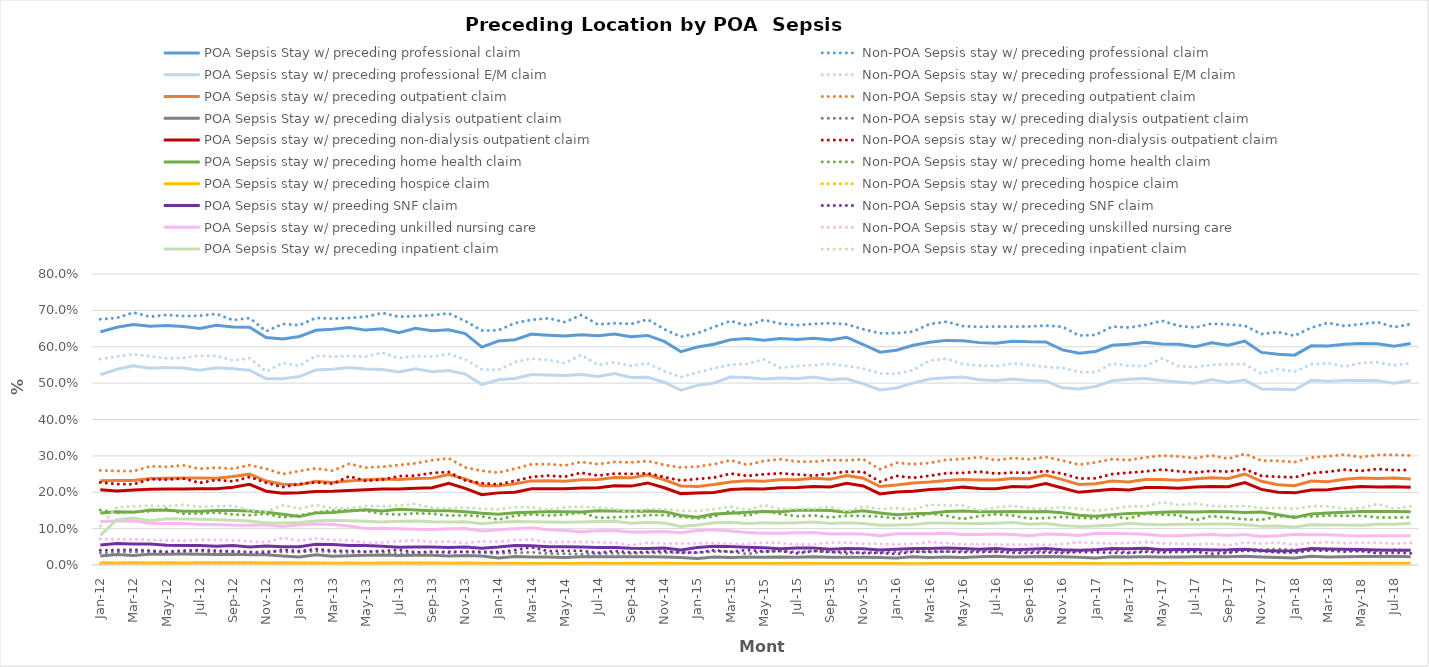
| Category | POA Sepsis Stay w/ preceding professional claim | Non-POA Sepsis stay w/ preceding professional claim | POA Sepsis stay w/ preceding professional E/M claim | Non-POA Sepsis stay w/ preceding professional E/M claim | POA Sepsis stay w/ preceding outpatient claim | Non-POA Sepsis stay w/ preceding outpatient claim | POA Sepsis Stay w/ preceding dialysis outpatient claim | Non-POA sepsis stay w/ preceding dialysis outpatient claim | POA Sepsis stay w/ preceding non-dialysis outpatient claim | Non-POA sepsis stay w/ preceding non-dialysis outpatient claim | POA Sepsis stay w/ preceding home health claim | Non-POA Sepsis stay w/ preceding home health claim | POA Sepsis stay w/ preceding hospice claim | Non-POA Sepsis stay w/ preceding hospice claim | POA Sepsis stay w/ preeding SNF claim | Non-POA Sepsis stay w/ preceding SNF claim | POA Sepsis stay w/ preceding unkilled nursing care | Non-POA Sepsis stay w/ preceding unskilled nursing care | POA Sepsis Stay w/ preceding inpatient claim | Non-POA Sepsis stay w/ preceding inpatient claim |
|---|---|---|---|---|---|---|---|---|---|---|---|---|---|---|---|---|---|---|---|---|
| 2012-01-01 | 0.641 | 0.676 | 0.523 | 0.566 | 0.232 | 0.26 | 0.025 | 0.033 | 0.207 | 0.227 | 0.143 | 0.151 | 0.006 | 0.003 | 0.055 | 0.041 | 0.119 | 0.071 | 0.082 | 0.107 |
| 2012-02-01 | 0.654 | 0.679 | 0.538 | 0.573 | 0.232 | 0.258 | 0.029 | 0.036 | 0.203 | 0.222 | 0.146 | 0.143 | 0.006 | 0.003 | 0.059 | 0.041 | 0.121 | 0.07 | 0.124 | 0.158 |
| 2012-03-01 | 0.661 | 0.694 | 0.548 | 0.579 | 0.232 | 0.258 | 0.026 | 0.036 | 0.206 | 0.222 | 0.145 | 0.147 | 0.006 | 0.004 | 0.058 | 0.042 | 0.122 | 0.071 | 0.129 | 0.161 |
| 2012-04-01 | 0.656 | 0.682 | 0.541 | 0.573 | 0.238 | 0.271 | 0.03 | 0.036 | 0.208 | 0.236 | 0.151 | 0.148 | 0.005 | 0.003 | 0.058 | 0.039 | 0.115 | 0.069 | 0.121 | 0.163 |
| 2012-05-01 | 0.658 | 0.688 | 0.543 | 0.568 | 0.238 | 0.27 | 0.029 | 0.035 | 0.209 | 0.235 | 0.15 | 0.154 | 0.006 | 0.003 | 0.054 | 0.037 | 0.114 | 0.068 | 0.127 | 0.162 |
| 2012-06-01 | 0.656 | 0.684 | 0.542 | 0.569 | 0.239 | 0.274 | 0.03 | 0.036 | 0.209 | 0.238 | 0.148 | 0.141 | 0.006 | 0.004 | 0.054 | 0.04 | 0.114 | 0.067 | 0.126 | 0.166 |
| 2012-07-01 | 0.651 | 0.685 | 0.535 | 0.575 | 0.239 | 0.265 | 0.03 | 0.039 | 0.209 | 0.226 | 0.148 | 0.141 | 0.006 | 0.004 | 0.053 | 0.041 | 0.112 | 0.07 | 0.126 | 0.16 |
| 2012-08-01 | 0.659 | 0.69 | 0.542 | 0.575 | 0.239 | 0.268 | 0.029 | 0.034 | 0.21 | 0.234 | 0.15 | 0.144 | 0.006 | 0.004 | 0.051 | 0.039 | 0.111 | 0.069 | 0.125 | 0.161 |
| 2012-09-01 | 0.654 | 0.673 | 0.54 | 0.562 | 0.244 | 0.265 | 0.03 | 0.035 | 0.214 | 0.23 | 0.15 | 0.139 | 0.006 | 0.003 | 0.053 | 0.038 | 0.109 | 0.068 | 0.123 | 0.163 |
| 2012-10-01 | 0.654 | 0.679 | 0.536 | 0.569 | 0.25 | 0.275 | 0.028 | 0.033 | 0.222 | 0.242 | 0.148 | 0.137 | 0.006 | 0.003 | 0.05 | 0.036 | 0.11 | 0.065 | 0.121 | 0.151 |
| 2012-11-01 | 0.626 | 0.643 | 0.512 | 0.532 | 0.231 | 0.264 | 0.028 | 0.038 | 0.203 | 0.226 | 0.145 | 0.141 | 0.006 | 0.003 | 0.052 | 0.033 | 0.111 | 0.063 | 0.116 | 0.147 |
| 2012-12-01 | 0.621 | 0.662 | 0.512 | 0.556 | 0.222 | 0.25 | 0.025 | 0.036 | 0.198 | 0.214 | 0.14 | 0.131 | 0.006 | 0.004 | 0.05 | 0.042 | 0.106 | 0.075 | 0.116 | 0.165 |
| 2013-01-01 | 0.628 | 0.659 | 0.518 | 0.548 | 0.22 | 0.258 | 0.022 | 0.036 | 0.198 | 0.223 | 0.133 | 0.136 | 0.005 | 0.003 | 0.05 | 0.038 | 0.11 | 0.067 | 0.117 | 0.155 |
| 2013-02-01 | 0.645 | 0.679 | 0.536 | 0.575 | 0.23 | 0.266 | 0.028 | 0.038 | 0.202 | 0.228 | 0.143 | 0.144 | 0.005 | 0.003 | 0.057 | 0.044 | 0.113 | 0.073 | 0.121 | 0.165 |
| 2013-03-01 | 0.648 | 0.677 | 0.538 | 0.573 | 0.227 | 0.259 | 0.024 | 0.036 | 0.203 | 0.223 | 0.144 | 0.149 | 0.005 | 0.003 | 0.057 | 0.039 | 0.111 | 0.069 | 0.123 | 0.156 |
| 2013-04-01 | 0.653 | 0.679 | 0.543 | 0.575 | 0.231 | 0.278 | 0.026 | 0.034 | 0.205 | 0.244 | 0.148 | 0.15 | 0.006 | 0.002 | 0.054 | 0.039 | 0.107 | 0.068 | 0.122 | 0.156 |
| 2013-05-01 | 0.646 | 0.682 | 0.539 | 0.573 | 0.234 | 0.268 | 0.027 | 0.036 | 0.207 | 0.231 | 0.152 | 0.149 | 0.005 | 0.002 | 0.053 | 0.036 | 0.1 | 0.06 | 0.12 | 0.162 |
| 2013-06-01 | 0.649 | 0.693 | 0.538 | 0.584 | 0.236 | 0.27 | 0.027 | 0.036 | 0.209 | 0.235 | 0.148 | 0.141 | 0.006 | 0.004 | 0.052 | 0.039 | 0.101 | 0.062 | 0.118 | 0.162 |
| 2013-07-01 | 0.639 | 0.682 | 0.531 | 0.569 | 0.235 | 0.275 | 0.026 | 0.03 | 0.209 | 0.244 | 0.153 | 0.139 | 0.005 | 0.003 | 0.049 | 0.041 | 0.1 | 0.066 | 0.12 | 0.163 |
| 2013-08-01 | 0.651 | 0.684 | 0.539 | 0.574 | 0.238 | 0.28 | 0.027 | 0.034 | 0.211 | 0.246 | 0.151 | 0.142 | 0.005 | 0.004 | 0.05 | 0.035 | 0.098 | 0.068 | 0.121 | 0.168 |
| 2013-09-01 | 0.644 | 0.687 | 0.531 | 0.573 | 0.239 | 0.288 | 0.027 | 0.035 | 0.212 | 0.253 | 0.149 | 0.141 | 0.005 | 0.003 | 0.05 | 0.037 | 0.098 | 0.063 | 0.119 | 0.157 |
| 2013-10-01 | 0.647 | 0.692 | 0.535 | 0.58 | 0.249 | 0.293 | 0.024 | 0.038 | 0.224 | 0.256 | 0.149 | 0.136 | 0.005 | 0.002 | 0.048 | 0.034 | 0.1 | 0.065 | 0.118 | 0.156 |
| 2013-11-01 | 0.636 | 0.671 | 0.525 | 0.565 | 0.237 | 0.268 | 0.026 | 0.036 | 0.211 | 0.232 | 0.147 | 0.137 | 0.005 | 0.003 | 0.049 | 0.037 | 0.1 | 0.06 | 0.119 | 0.158 |
| 2013-12-01 | 0.599 | 0.644 | 0.496 | 0.538 | 0.218 | 0.259 | 0.024 | 0.034 | 0.193 | 0.225 | 0.142 | 0.134 | 0.005 | 0.002 | 0.046 | 0.036 | 0.094 | 0.065 | 0.114 | 0.155 |
| 2014-01-01 | 0.616 | 0.645 | 0.509 | 0.536 | 0.218 | 0.254 | 0.019 | 0.032 | 0.198 | 0.222 | 0.139 | 0.125 | 0.004 | 0.002 | 0.049 | 0.036 | 0.097 | 0.064 | 0.118 | 0.153 |
| 2014-02-01 | 0.619 | 0.665 | 0.513 | 0.558 | 0.223 | 0.265 | 0.023 | 0.034 | 0.2 | 0.231 | 0.144 | 0.136 | 0.005 | 0.002 | 0.054 | 0.041 | 0.099 | 0.068 | 0.12 | 0.159 |
| 2014-03-01 | 0.635 | 0.674 | 0.524 | 0.567 | 0.231 | 0.277 | 0.022 | 0.035 | 0.209 | 0.242 | 0.145 | 0.139 | 0.004 | 0.002 | 0.053 | 0.049 | 0.102 | 0.07 | 0.119 | 0.159 |
| 2014-04-01 | 0.632 | 0.678 | 0.522 | 0.564 | 0.231 | 0.277 | 0.022 | 0.031 | 0.21 | 0.246 | 0.147 | 0.136 | 0.004 | 0.004 | 0.05 | 0.038 | 0.097 | 0.062 | 0.118 | 0.152 |
| 2014-05-01 | 0.629 | 0.667 | 0.521 | 0.555 | 0.23 | 0.273 | 0.021 | 0.031 | 0.21 | 0.243 | 0.146 | 0.139 | 0.004 | 0.003 | 0.05 | 0.039 | 0.095 | 0.064 | 0.118 | 0.158 |
| 2014-06-01 | 0.633 | 0.687 | 0.523 | 0.577 | 0.234 | 0.283 | 0.023 | 0.03 | 0.212 | 0.254 | 0.146 | 0.144 | 0.004 | 0.002 | 0.049 | 0.039 | 0.092 | 0.063 | 0.118 | 0.16 |
| 2014-07-01 | 0.63 | 0.661 | 0.518 | 0.55 | 0.235 | 0.277 | 0.023 | 0.031 | 0.212 | 0.246 | 0.149 | 0.13 | 0.005 | 0.002 | 0.048 | 0.033 | 0.094 | 0.062 | 0.12 | 0.158 |
| 2014-08-01 | 0.635 | 0.665 | 0.526 | 0.557 | 0.24 | 0.283 | 0.023 | 0.032 | 0.218 | 0.251 | 0.149 | 0.131 | 0.004 | 0.003 | 0.048 | 0.038 | 0.095 | 0.061 | 0.12 | 0.154 |
| 2014-09-01 | 0.628 | 0.663 | 0.515 | 0.547 | 0.24 | 0.282 | 0.023 | 0.032 | 0.217 | 0.25 | 0.148 | 0.133 | 0.005 | 0.004 | 0.046 | 0.034 | 0.091 | 0.054 | 0.115 | 0.145 |
| 2014-10-01 | 0.631 | 0.675 | 0.516 | 0.555 | 0.248 | 0.286 | 0.023 | 0.034 | 0.226 | 0.252 | 0.148 | 0.137 | 0.004 | 0.002 | 0.046 | 0.036 | 0.091 | 0.061 | 0.118 | 0.154 |
| 2014-11-01 | 0.615 | 0.648 | 0.503 | 0.533 | 0.234 | 0.275 | 0.022 | 0.033 | 0.212 | 0.242 | 0.147 | 0.137 | 0.005 | 0.003 | 0.047 | 0.038 | 0.092 | 0.059 | 0.115 | 0.153 |
| 2014-12-01 | 0.586 | 0.627 | 0.481 | 0.516 | 0.217 | 0.268 | 0.021 | 0.036 | 0.196 | 0.232 | 0.136 | 0.132 | 0.004 | 0.002 | 0.041 | 0.034 | 0.089 | 0.059 | 0.106 | 0.149 |
| 2015-01-01 | 0.599 | 0.637 | 0.494 | 0.529 | 0.216 | 0.271 | 0.018 | 0.034 | 0.198 | 0.237 | 0.131 | 0.128 | 0.004 | 0.003 | 0.048 | 0.034 | 0.095 | 0.059 | 0.11 | 0.148 |
| 2015-02-01 | 0.607 | 0.654 | 0.5 | 0.541 | 0.221 | 0.277 | 0.022 | 0.037 | 0.199 | 0.24 | 0.14 | 0.133 | 0.004 | 0.002 | 0.052 | 0.041 | 0.097 | 0.061 | 0.116 | 0.154 |
| 2015-03-01 | 0.619 | 0.671 | 0.517 | 0.55 | 0.228 | 0.288 | 0.021 | 0.037 | 0.207 | 0.251 | 0.142 | 0.149 | 0.004 | 0.003 | 0.051 | 0.036 | 0.094 | 0.058 | 0.117 | 0.16 |
| 2015-04-01 | 0.623 | 0.658 | 0.515 | 0.553 | 0.232 | 0.275 | 0.022 | 0.03 | 0.209 | 0.245 | 0.145 | 0.135 | 0.004 | 0.002 | 0.049 | 0.041 | 0.089 | 0.057 | 0.114 | 0.151 |
| 2015-05-01 | 0.618 | 0.674 | 0.512 | 0.565 | 0.23 | 0.286 | 0.021 | 0.037 | 0.209 | 0.249 | 0.147 | 0.15 | 0.004 | 0.004 | 0.047 | 0.037 | 0.087 | 0.062 | 0.116 | 0.165 |
| 2015-06-01 | 0.623 | 0.664 | 0.514 | 0.542 | 0.234 | 0.291 | 0.022 | 0.038 | 0.212 | 0.252 | 0.146 | 0.14 | 0.004 | 0.002 | 0.045 | 0.038 | 0.087 | 0.06 | 0.115 | 0.154 |
| 2015-07-01 | 0.62 | 0.659 | 0.512 | 0.547 | 0.234 | 0.284 | 0.021 | 0.035 | 0.213 | 0.249 | 0.15 | 0.134 | 0.005 | 0.002 | 0.046 | 0.032 | 0.089 | 0.057 | 0.116 | 0.154 |
| 2015-08-01 | 0.624 | 0.663 | 0.517 | 0.549 | 0.239 | 0.284 | 0.023 | 0.039 | 0.216 | 0.245 | 0.15 | 0.136 | 0.004 | 0.003 | 0.047 | 0.038 | 0.089 | 0.057 | 0.118 | 0.155 |
| 2015-09-01 | 0.619 | 0.665 | 0.51 | 0.554 | 0.236 | 0.288 | 0.022 | 0.037 | 0.214 | 0.252 | 0.15 | 0.131 | 0.004 | 0.003 | 0.043 | 0.035 | 0.085 | 0.061 | 0.114 | 0.16 |
| 2015-10-01 | 0.626 | 0.662 | 0.512 | 0.547 | 0.246 | 0.288 | 0.022 | 0.031 | 0.225 | 0.256 | 0.145 | 0.135 | 0.004 | 0.004 | 0.045 | 0.037 | 0.086 | 0.062 | 0.116 | 0.147 |
| 2015-11-01 | 0.606 | 0.648 | 0.498 | 0.54 | 0.238 | 0.291 | 0.021 | 0.034 | 0.217 | 0.256 | 0.149 | 0.135 | 0.004 | 0.002 | 0.045 | 0.033 | 0.085 | 0.058 | 0.114 | 0.161 |
| 2015-12-01 | 0.585 | 0.637 | 0.481 | 0.526 | 0.216 | 0.263 | 0.02 | 0.035 | 0.195 | 0.229 | 0.143 | 0.133 | 0.004 | 0.002 | 0.041 | 0.033 | 0.08 | 0.058 | 0.109 | 0.154 |
| 2016-01-01 | 0.591 | 0.637 | 0.487 | 0.525 | 0.22 | 0.281 | 0.019 | 0.036 | 0.201 | 0.245 | 0.138 | 0.128 | 0.004 | 0.002 | 0.043 | 0.03 | 0.086 | 0.057 | 0.11 | 0.156 |
| 2016-02-01 | 0.604 | 0.642 | 0.5 | 0.536 | 0.226 | 0.277 | 0.023 | 0.038 | 0.203 | 0.24 | 0.141 | 0.131 | 0.004 | 0.002 | 0.045 | 0.036 | 0.086 | 0.058 | 0.112 | 0.152 |
| 2016-03-01 | 0.612 | 0.662 | 0.511 | 0.562 | 0.228 | 0.28 | 0.021 | 0.035 | 0.207 | 0.245 | 0.142 | 0.141 | 0.004 | 0.003 | 0.045 | 0.037 | 0.086 | 0.063 | 0.115 | 0.166 |
| 2016-04-01 | 0.617 | 0.669 | 0.515 | 0.567 | 0.232 | 0.289 | 0.022 | 0.037 | 0.21 | 0.252 | 0.147 | 0.135 | 0.004 | 0.002 | 0.047 | 0.037 | 0.087 | 0.06 | 0.115 | 0.164 |
| 2016-05-01 | 0.617 | 0.657 | 0.517 | 0.552 | 0.235 | 0.291 | 0.021 | 0.038 | 0.214 | 0.253 | 0.148 | 0.126 | 0.004 | 0.003 | 0.046 | 0.035 | 0.084 | 0.057 | 0.114 | 0.163 |
| 2016-06-01 | 0.611 | 0.655 | 0.509 | 0.549 | 0.234 | 0.297 | 0.023 | 0.04 | 0.211 | 0.257 | 0.146 | 0.134 | 0.004 | 0.002 | 0.044 | 0.036 | 0.084 | 0.057 | 0.114 | 0.15 |
| 2016-07-01 | 0.61 | 0.656 | 0.507 | 0.547 | 0.234 | 0.288 | 0.024 | 0.037 | 0.21 | 0.251 | 0.146 | 0.139 | 0.004 | 0.003 | 0.045 | 0.037 | 0.085 | 0.056 | 0.115 | 0.158 |
| 2016-08-01 | 0.615 | 0.655 | 0.511 | 0.554 | 0.238 | 0.294 | 0.022 | 0.04 | 0.216 | 0.254 | 0.147 | 0.136 | 0.004 | 0.003 | 0.042 | 0.034 | 0.084 | 0.056 | 0.117 | 0.163 |
| 2016-09-01 | 0.614 | 0.656 | 0.507 | 0.55 | 0.237 | 0.29 | 0.023 | 0.037 | 0.214 | 0.254 | 0.146 | 0.128 | 0.004 | 0.001 | 0.043 | 0.033 | 0.08 | 0.056 | 0.112 | 0.155 |
| 2016-10-01 | 0.613 | 0.658 | 0.506 | 0.544 | 0.247 | 0.297 | 0.023 | 0.039 | 0.224 | 0.258 | 0.147 | 0.129 | 0.004 | 0.002 | 0.045 | 0.034 | 0.085 | 0.055 | 0.114 | 0.154 |
| 2016-11-01 | 0.591 | 0.655 | 0.487 | 0.542 | 0.235 | 0.287 | 0.023 | 0.036 | 0.212 | 0.251 | 0.144 | 0.132 | 0.005 | 0.003 | 0.042 | 0.033 | 0.084 | 0.058 | 0.109 | 0.159 |
| 2016-12-01 | 0.582 | 0.631 | 0.484 | 0.53 | 0.221 | 0.276 | 0.021 | 0.038 | 0.2 | 0.238 | 0.137 | 0.129 | 0.004 | 0.003 | 0.04 | 0.036 | 0.081 | 0.063 | 0.106 | 0.155 |
| 2017-01-01 | 0.587 | 0.632 | 0.49 | 0.53 | 0.223 | 0.282 | 0.019 | 0.044 | 0.204 | 0.238 | 0.134 | 0.128 | 0.004 | 0.003 | 0.042 | 0.035 | 0.086 | 0.06 | 0.107 | 0.149 |
| 2017-02-01 | 0.604 | 0.655 | 0.506 | 0.554 | 0.231 | 0.291 | 0.023 | 0.041 | 0.208 | 0.25 | 0.138 | 0.133 | 0.004 | 0.002 | 0.045 | 0.034 | 0.087 | 0.059 | 0.109 | 0.154 |
| 2017-03-01 | 0.607 | 0.653 | 0.511 | 0.548 | 0.228 | 0.288 | 0.022 | 0.035 | 0.206 | 0.254 | 0.142 | 0.128 | 0.004 | 0.002 | 0.045 | 0.033 | 0.086 | 0.061 | 0.114 | 0.161 |
| 2017-04-01 | 0.612 | 0.66 | 0.513 | 0.547 | 0.235 | 0.296 | 0.022 | 0.039 | 0.213 | 0.257 | 0.143 | 0.141 | 0.004 | 0.002 | 0.046 | 0.036 | 0.085 | 0.063 | 0.112 | 0.161 |
| 2017-05-01 | 0.608 | 0.671 | 0.507 | 0.568 | 0.235 | 0.301 | 0.022 | 0.038 | 0.213 | 0.262 | 0.145 | 0.139 | 0.004 | 0.002 | 0.042 | 0.034 | 0.08 | 0.06 | 0.111 | 0.172 |
| 2017-06-01 | 0.607 | 0.657 | 0.503 | 0.547 | 0.233 | 0.299 | 0.022 | 0.041 | 0.211 | 0.258 | 0.147 | 0.137 | 0.005 | 0.003 | 0.043 | 0.036 | 0.08 | 0.059 | 0.112 | 0.165 |
| 2017-07-01 | 0.6 | 0.653 | 0.499 | 0.544 | 0.237 | 0.294 | 0.023 | 0.039 | 0.215 | 0.254 | 0.146 | 0.122 | 0.004 | 0.002 | 0.042 | 0.036 | 0.082 | 0.057 | 0.112 | 0.168 |
| 2017-08-01 | 0.611 | 0.664 | 0.51 | 0.55 | 0.24 | 0.302 | 0.024 | 0.043 | 0.216 | 0.259 | 0.147 | 0.135 | 0.004 | 0.002 | 0.041 | 0.031 | 0.084 | 0.059 | 0.113 | 0.162 |
| 2017-09-01 | 0.604 | 0.661 | 0.502 | 0.552 | 0.238 | 0.292 | 0.022 | 0.036 | 0.215 | 0.257 | 0.146 | 0.13 | 0.004 | 0.002 | 0.042 | 0.033 | 0.081 | 0.054 | 0.113 | 0.161 |
| 2017-10-01 | 0.615 | 0.658 | 0.508 | 0.552 | 0.25 | 0.306 | 0.024 | 0.042 | 0.226 | 0.263 | 0.145 | 0.125 | 0.004 | 0.004 | 0.043 | 0.039 | 0.084 | 0.062 | 0.11 | 0.162 |
| 2017-11-01 | 0.584 | 0.635 | 0.484 | 0.526 | 0.23 | 0.287 | 0.022 | 0.042 | 0.208 | 0.245 | 0.146 | 0.124 | 0.004 | 0.002 | 0.04 | 0.038 | 0.078 | 0.059 | 0.107 | 0.157 |
| 2017-12-01 | 0.579 | 0.64 | 0.483 | 0.539 | 0.221 | 0.286 | 0.021 | 0.044 | 0.2 | 0.242 | 0.138 | 0.134 | 0.004 | 0.002 | 0.038 | 0.035 | 0.08 | 0.061 | 0.107 | 0.157 |
| 2018-01-01 | 0.577 | 0.63 | 0.482 | 0.531 | 0.218 | 0.283 | 0.019 | 0.042 | 0.198 | 0.241 | 0.13 | 0.134 | 0.004 | 0.002 | 0.039 | 0.034 | 0.084 | 0.056 | 0.104 | 0.155 |
| 2018-02-01 | 0.602 | 0.652 | 0.508 | 0.552 | 0.231 | 0.296 | 0.024 | 0.043 | 0.206 | 0.253 | 0.14 | 0.133 | 0.004 | 0.003 | 0.045 | 0.04 | 0.083 | 0.061 | 0.111 | 0.162 |
| 2018-03-01 | 0.602 | 0.666 | 0.505 | 0.555 | 0.229 | 0.299 | 0.022 | 0.043 | 0.207 | 0.256 | 0.143 | 0.136 | 0.004 | 0.003 | 0.044 | 0.04 | 0.083 | 0.063 | 0.11 | 0.161 |
| 2018-04-01 | 0.607 | 0.657 | 0.507 | 0.546 | 0.236 | 0.304 | 0.023 | 0.041 | 0.213 | 0.262 | 0.145 | 0.135 | 0.004 | 0.002 | 0.043 | 0.037 | 0.081 | 0.06 | 0.11 | 0.155 |
| 2018-05-01 | 0.609 | 0.662 | 0.508 | 0.556 | 0.239 | 0.297 | 0.024 | 0.038 | 0.215 | 0.259 | 0.147 | 0.135 | 0.005 | 0.003 | 0.042 | 0.039 | 0.08 | 0.061 | 0.109 | 0.156 |
| 2018-06-01 | 0.608 | 0.668 | 0.507 | 0.557 | 0.238 | 0.303 | 0.023 | 0.039 | 0.214 | 0.264 | 0.147 | 0.131 | 0.005 | 0.003 | 0.041 | 0.032 | 0.08 | 0.061 | 0.112 | 0.168 |
| 2018-07-01 | 0.601 | 0.654 | 0.5 | 0.549 | 0.239 | 0.303 | 0.024 | 0.042 | 0.215 | 0.261 | 0.147 | 0.13 | 0.005 | 0.003 | 0.04 | 0.034 | 0.08 | 0.058 | 0.112 | 0.155 |
| 2018-08-01 | 0.609 | 0.662 | 0.507 | 0.555 | 0.237 | 0.301 | 0.023 | 0.04 | 0.214 | 0.261 | 0.147 | 0.131 | 0.005 | 0.002 | 0.041 | 0.032 | 0.08 | 0.061 | 0.115 | 0.161 |